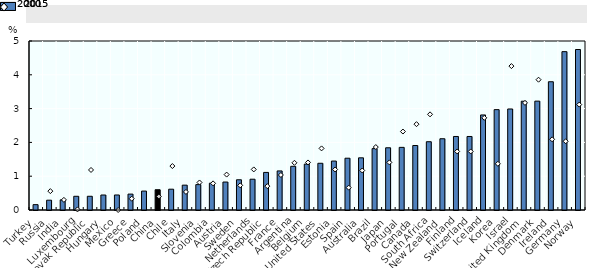
| Category | 2015 |
|---|---|
| Turkey | 0.158 |
| Russia | 0.29 |
| India | 0.3 |
| Luxembourg | 0.406 |
| Slovak Republic | 0.406 |
| Hungary | 0.444 |
| Mexico | 0.444 |
| Greece | 0.47 |
| Poland | 0.56 |
| China | 0.6 |
| Chile | 0.615 |
| Italy | 0.735 |
| Slovenia | 0.752 |
| Colombia | 0.794 |
| Austria | 0.827 |
| Sweden | 0.894 |
| Netherlands | 0.911 |
| Czech Republic | 1.112 |
| France | 1.156 |
| Argentina | 1.293 |
| Belgium | 1.358 |
| United States | 1.383 |
| Estonia | 1.448 |
| Spain | 1.532 |
| Australia | 1.544 |
| Brazil | 1.816 |
| Japan | 1.841 |
| Portugal | 1.853 |
| Canada | 1.908 |
| South Africa | 2.02 |
| New Zealand | 2.108 |
| Finland | 2.175 |
| Switzerland | 2.175 |
| Iceland | 2.812 |
| Korea | 2.969 |
| Israel | 2.989 |
| United Kingdom | 3.219 |
| Denmark | 3.221 |
| Ireland | 3.795 |
| Germany | 4.685 |
| Norway | 4.748 |